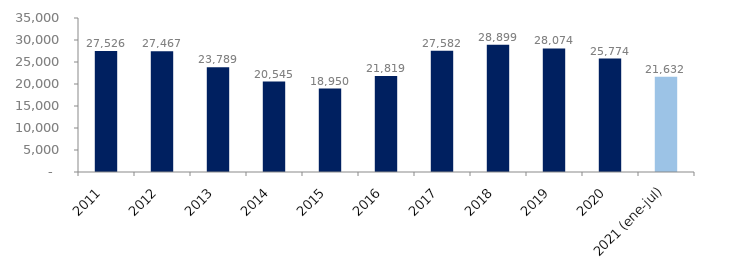
| Category | Series 1 |
|---|---|
| 2011 | 27525.675 |
| 2012 | 27466.673 |
| 2013 | 23789.445 |
| 2014 | 20545.414 |
| 2015 | 18950.14 |
| 2016 | 21819.079 |
| 2017 | 27581.607 |
| 2018 | 28898.658 |
| 2019 | 28073.793 |
| 2020 | 25773.552 |
| 2021 (ene-jul) | 21632.059 |